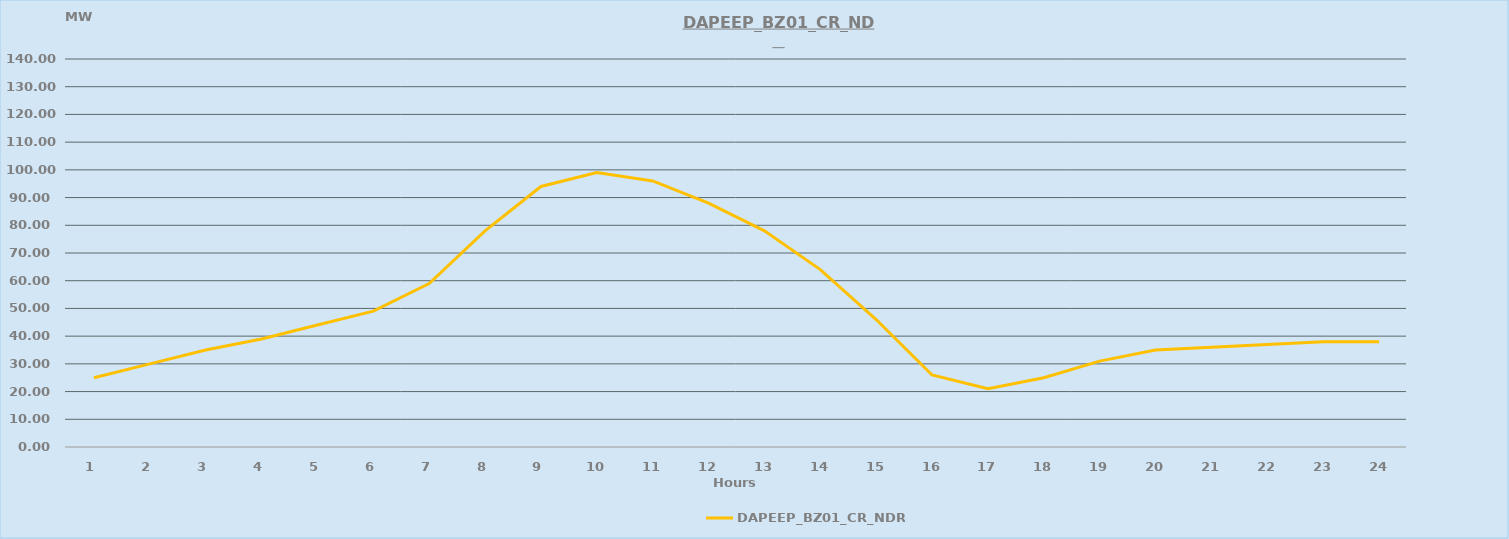
| Category | DAPEEP_BZ01_CR_NDR |
|---|---|
| 0 | 25 |
| 1 | 30 |
| 2 | 35 |
| 3 | 39 |
| 4 | 44 |
| 5 | 49 |
| 6 | 59 |
| 7 | 78 |
| 8 | 94 |
| 9 | 99 |
| 10 | 96 |
| 11 | 88 |
| 12 | 78 |
| 13 | 64 |
| 14 | 46 |
| 15 | 26 |
| 16 | 21 |
| 17 | 25 |
| 18 | 31 |
| 19 | 35 |
| 20 | 36 |
| 21 | 37 |
| 22 | 38 |
| 23 | 38 |